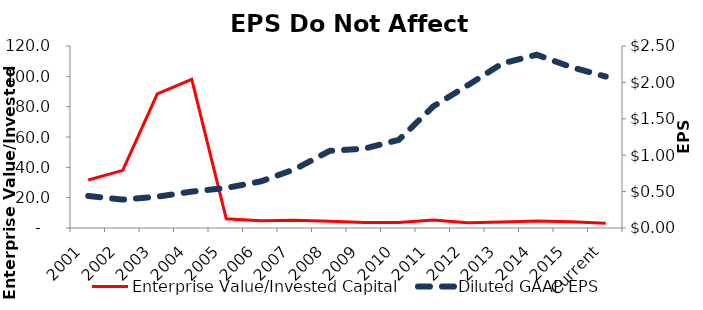
| Category | Enterprise Value/Invested Capital |
|---|---|
| 2001 | 31.64 |
| 2002 | 38.03 |
| 2003 | 88.37 |
| 2004 | 97.98 |
| 2005 | 6.02 |
| 2006 | 4.79 |
| 2007 | 5.1 |
| 2008 | 4.41 |
| 2009 | 3.58 |
| 2010 | 3.62 |
| 2011 | 5.34 |
| 2012 | 3.39 |
| 2013 | 4.01 |
| 2014 | 4.59 |
| 2015 | 4.07 |
| Current | 3.17 |